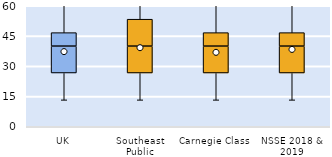
| Category | 25th | 50th | 75th |
|---|---|---|---|
| UK | 26.667 | 13.333 | 6.667 |
| Southeast Public | 26.667 | 13.333 | 13.333 |
| Carnegie Class | 26.667 | 13.333 | 6.667 |
| NSSE 2018 & 2019 | 26.667 | 13.333 | 6.667 |